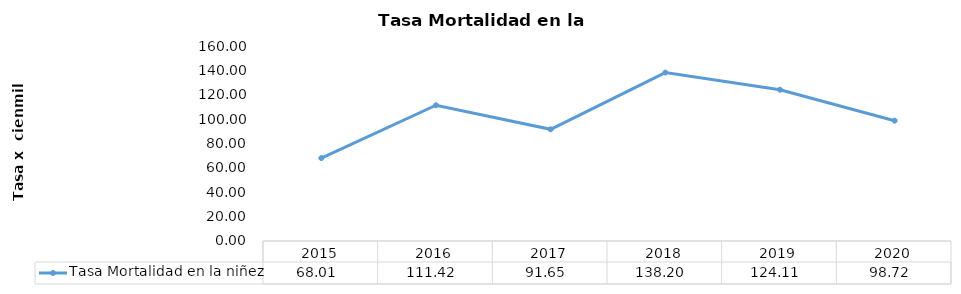
| Category | Tasa Mortalidad en la niñez |
|---|---|
| 2015.0 | 68.011 |
| 2016.0 | 111.418 |
| 2017.0 | 91.646 |
| 2018.0 | 138.2 |
| 2019.0 | 124.108 |
| 2020.0 | 98.723 |